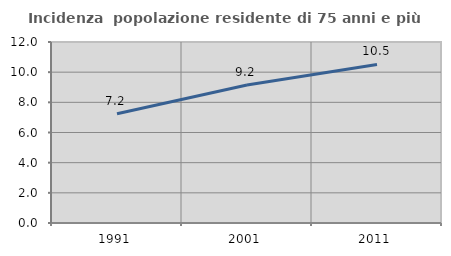
| Category | Incidenza  popolazione residente di 75 anni e più |
|---|---|
| 1991.0 | 7.247 |
| 2001.0 | 9.154 |
| 2011.0 | 10.509 |